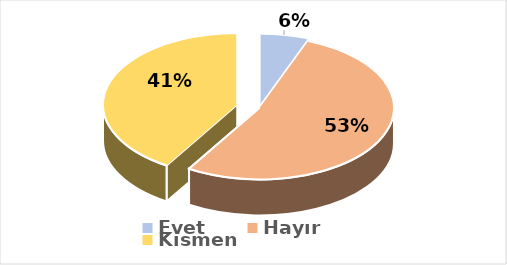
| Category | Evet |
|---|---|
| Evet | 0.059 |
| Hayır | 0.529 |
| Kısmen | 0.412 |